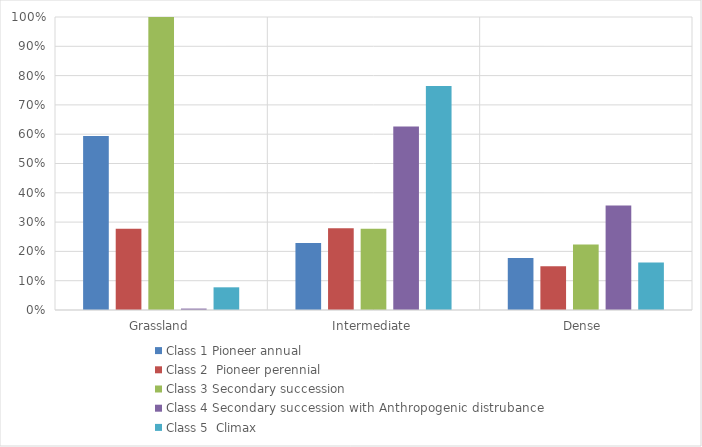
| Category | Class 1 | Class 2  | Class 3 | Class 4 | Class 5  |
|---|---|---|---|---|---|
| Grassland | 0.594 | 0.277 | 1.018 | 0.005 | 0.077 |
| Intermediate | 0.229 | 0.279 | 0.277 | 0.626 | 0.765 |
| Dense  | 0.177 | 0.15 | 0.224 | 0.356 | 0.162 |